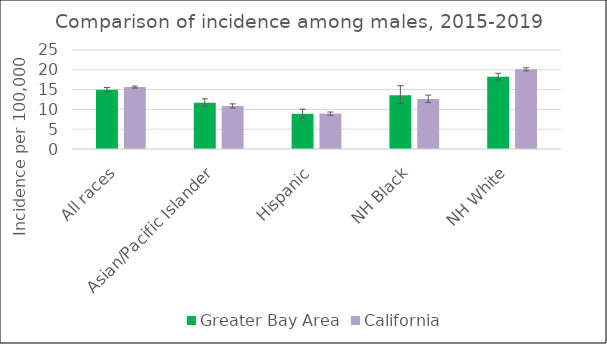
| Category | Greater Bay Area | California | SEER 18 |
|---|---|---|---|
| All races | 14.98 | 15.63 |  |
| Asian/Pacific Islander | 11.71 | 10.87 |  |
| Hispanic | 8.89 | 8.94 |  |
| NH Black | 13.58 | 12.65 |  |
| NH White | 18.25 | 20.12 |  |